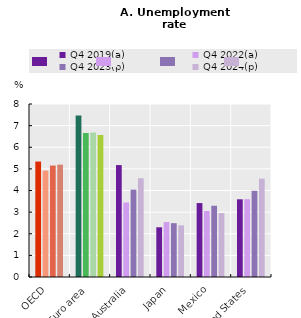
| Category | Q4 2019(a) | Q4 2022(a) | Q4 2023(p) | Q4 2024(p) |
|---|---|---|---|---|
| OECD | 5.339 | 4.922 | 5.154 | 5.195 |
| Euro area | 7.468 | 6.663 | 6.687 | 6.568 |
| Australia | 5.176 | 3.448 | 4.039 | 4.564 |
| Japan | 2.3 | 2.541 | 2.49 | 2.39 |
| Mexico | 3.42 | 3.053 | 3.294 | 2.957 |
| United States | 3.593 | 3.597 | 3.989 | 4.549 |